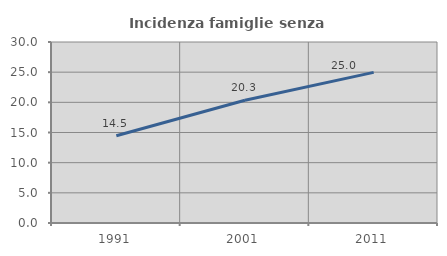
| Category | Incidenza famiglie senza nuclei |
|---|---|
| 1991.0 | 14.469 |
| 2001.0 | 20.344 |
| 2011.0 | 24.97 |